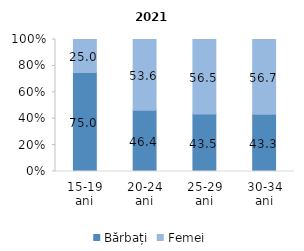
| Category | Bărbați | Femei |
|---|---|---|
| 15-19 ani | 75 | 25 |
| 20-24 ani | 46.4 | 53.6 |
| 25-29 ani | 43.5 | 56.5 |
| 30-34 ani | 43.3 | 56.7 |